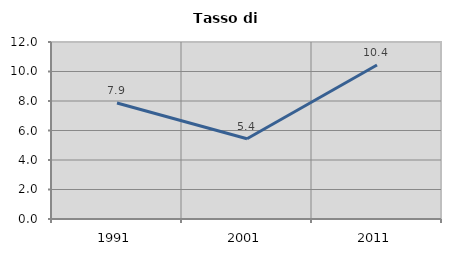
| Category | Tasso di disoccupazione   |
|---|---|
| 1991.0 | 7.862 |
| 2001.0 | 5.442 |
| 2011.0 | 10.438 |